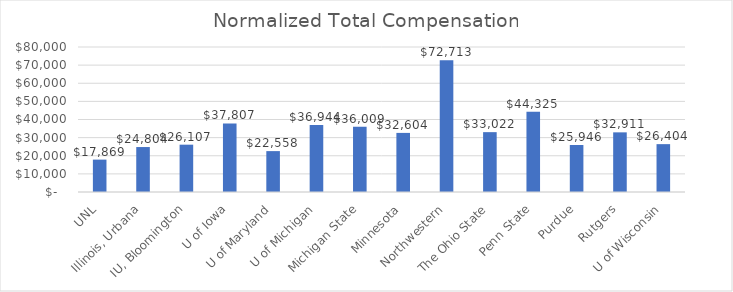
| Category | Series 0 |
|---|---|
| UNL | 17869.183 |
| Illinois, Urbana | 24804.496 |
| IU, Bloomington | 26106.561 |
| U of Iowa | 37806.841 |
| U of Maryland | 22558.48 |
| U of Michigan | 36943.964 |
| Michigan State | 36009.209 |
| Minnesota | 32604.054 |
| Northwestern | 72713.233 |
| The Ohio State | 33022.024 |
| Penn State | 44324.689 |
| Purdue | 25946.057 |
| Rutgers | 32910.782 |
| U of Wisconsin | 26403.881 |